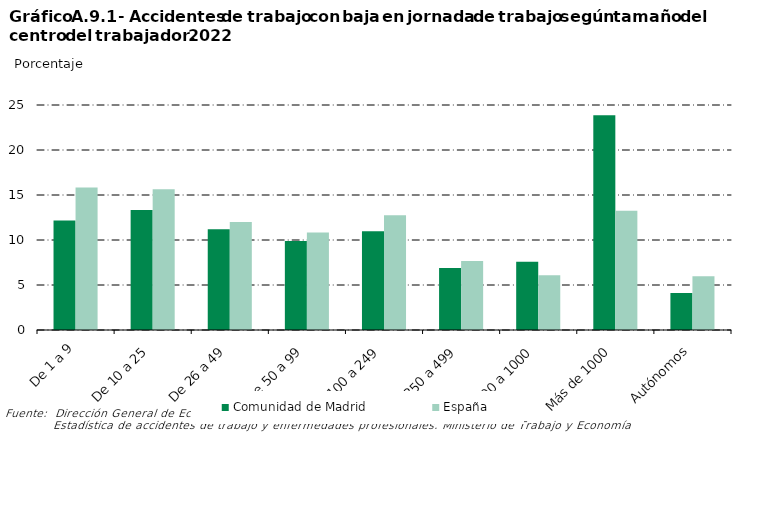
| Category | Comunidad de Madrid | España |
|---|---|---|
| 0 | 12.17 | 15.83 |
| 1 | 13.326 | 15.652 |
| 2 | 11.183 | 11.997 |
| 3 | 9.892 | 10.835 |
| 4 | 10.966 | 12.738 |
| 5 | 6.9 | 7.664 |
| 6 | 7.588 | 6.077 |
| 7 | 23.866 | 13.245 |
| 8 | 4.11 | 5.962 |